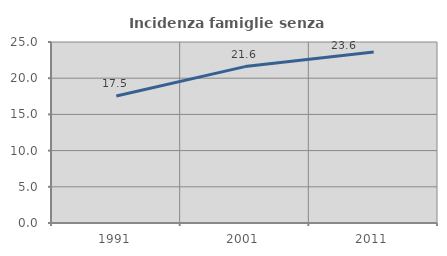
| Category | Incidenza famiglie senza nuclei |
|---|---|
| 1991.0 | 17.544 |
| 2001.0 | 21.601 |
| 2011.0 | 23.609 |